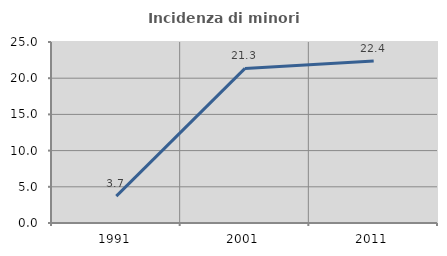
| Category | Incidenza di minori stranieri |
|---|---|
| 1991.0 | 3.704 |
| 2001.0 | 21.348 |
| 2011.0 | 22.368 |